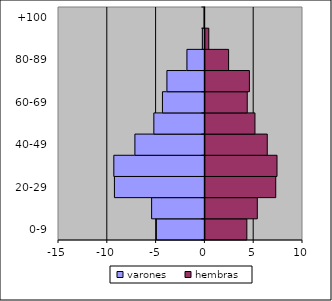
| Category | varones | hembras |
|---|---|---|
| 0-9 | -4.97 | 4.35 |
| 10-19 | -5.46 | 5.42 |
| 20-29 | -9.27 | 7.31 |
| 30-39 | -9.33 | 7.44 |
| 40-49 | -7.17 | 6.44 |
| 50-59 | -5.23 | 5.18 |
| 60-69 | -4.35 | 4.39 |
| 70-79 | -3.89 | 4.61 |
| 80-89 | -1.84 | 2.48 |
| 90-99 | -0.26 | 0.45 |
| +100 | -0.08 | 0.01 |